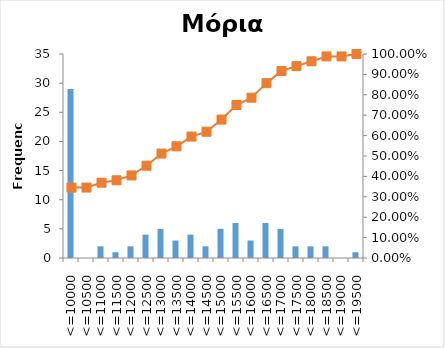
| Category | Series 0 |
|---|---|
| <=10000 | 29 |
| <=10500 | 0 |
| <=11000 | 2 |
| <=11500 | 1 |
| <=12000 | 2 |
| <=12500 | 4 |
| <=13000 | 5 |
| <=13500 | 3 |
| <=14000 | 4 |
| <=14500 | 2 |
| <=15000 | 5 |
| <=15500 | 6 |
| <=16000 | 3 |
| <=16500 | 6 |
| <=17000 | 5 |
| <=17500 | 2 |
| <=18000 | 2 |
| <=18500 | 2 |
| <=19000 | 0 |
| <=19500 | 1 |